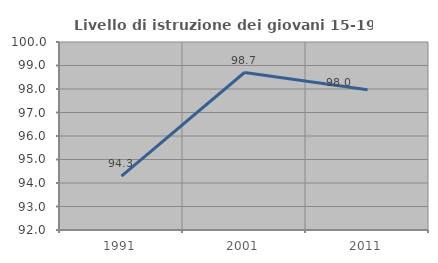
| Category | Livello di istruzione dei giovani 15-19 anni |
|---|---|
| 1991.0 | 94.293 |
| 2001.0 | 98.701 |
| 2011.0 | 97.97 |